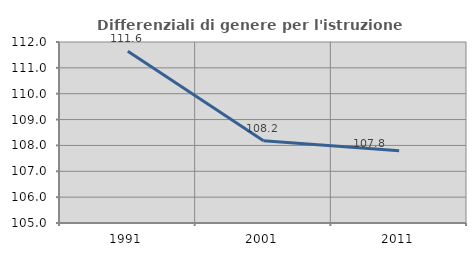
| Category | Differenziali di genere per l'istruzione superiore |
|---|---|
| 1991.0 | 111.638 |
| 2001.0 | 108.183 |
| 2011.0 | 107.796 |